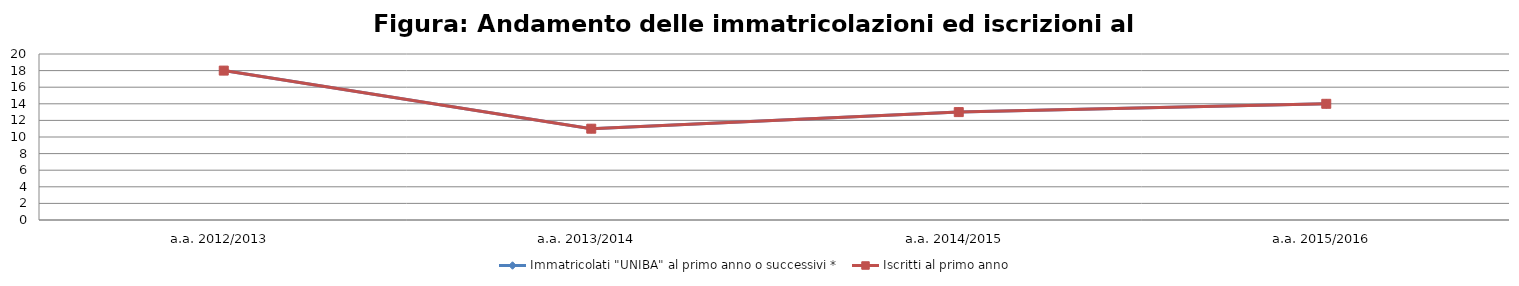
| Category | Immatricolati "UNIBA" al primo anno o successivi * | Iscritti al primo anno  |
|---|---|---|
| a.a. 2012/2013 | 18 | 18 |
| a.a. 2013/2014 | 11 | 11 |
| a.a. 2014/2015 | 13 | 13 |
| a.a. 2015/2016 | 14 | 14 |